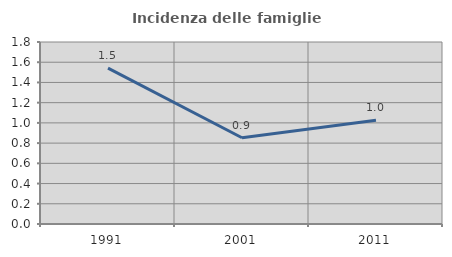
| Category | Incidenza delle famiglie numerose |
|---|---|
| 1991.0 | 1.542 |
| 2001.0 | 0.853 |
| 2011.0 | 1.025 |